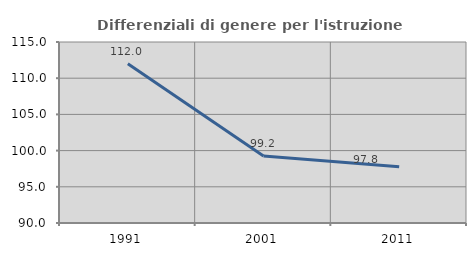
| Category | Differenziali di genere per l'istruzione superiore |
|---|---|
| 1991.0 | 111.997 |
| 2001.0 | 99.24 |
| 2011.0 | 97.755 |